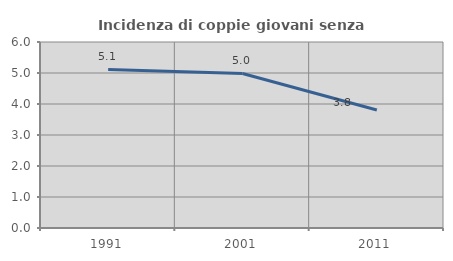
| Category | Incidenza di coppie giovani senza figli |
|---|---|
| 1991.0 | 5.116 |
| 2001.0 | 4.986 |
| 2011.0 | 3.808 |